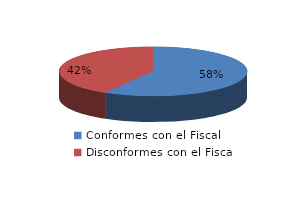
| Category | Series 0 |
|---|---|
| 0 | 111 |
| 1 | 79 |